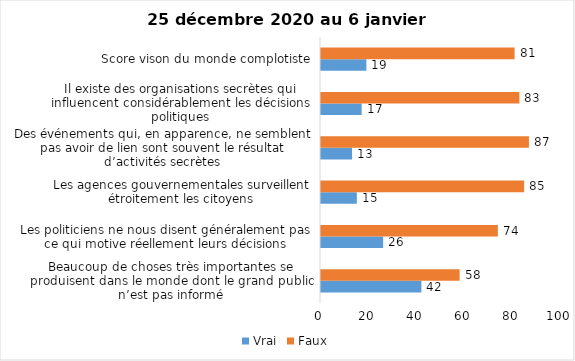
| Category | Vrai | Faux |
|---|---|---|
| Beaucoup de choses très importantes se produisent dans le monde dont le grand public n’est pas informé | 42 | 58 |
| Les politiciens ne nous disent généralement pas ce qui motive réellement leurs décisions | 26 | 74 |
| Les agences gouvernementales surveillent étroitement les citoyens | 15 | 85 |
| Des événements qui, en apparence, ne semblent pas avoir de lien sont souvent le résultat d’activités secrètes | 13 | 87 |
| Il existe des organisations secrètes qui influencent considérablement les décisions politiques | 17 | 83 |
| Score vison du monde complotiste | 19 | 81 |